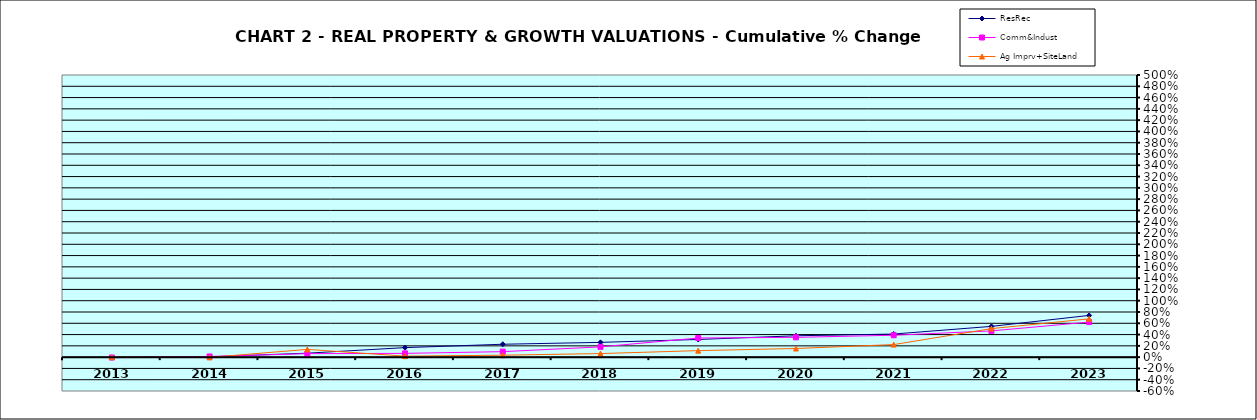
| Category | ResRec | Comm&Indust | Ag Imprv+SiteLand |
|---|---|---|---|
| 2013.0 | -0.009 | -0.007 | 0 |
| 2014.0 | 0.005 | 0.012 | -0.005 |
| 2015.0 | 0.07 | 0.062 | 0.137 |
| 2016.0 | 0.169 | 0.067 | 0.018 |
| 2017.0 | 0.229 | 0.097 | 0.034 |
| 2018.0 | 0.262 | 0.182 | 0.063 |
| 2019.0 | 0.313 | 0.339 | 0.115 |
| 2020.0 | 0.379 | 0.351 | 0.153 |
| 2021.0 | 0.41 | 0.388 | 0.223 |
| 2022.0 | 0.545 | 0.465 | 0.505 |
| 2023.0 | 0.74 | 0.622 | 0.679 |